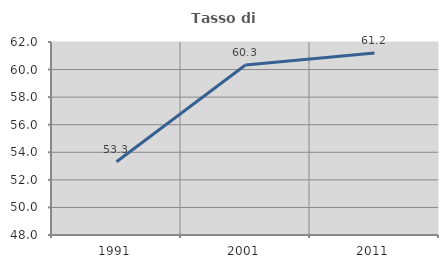
| Category | Tasso di occupazione   |
|---|---|
| 1991.0 | 53.313 |
| 2001.0 | 60.335 |
| 2011.0 | 61.201 |